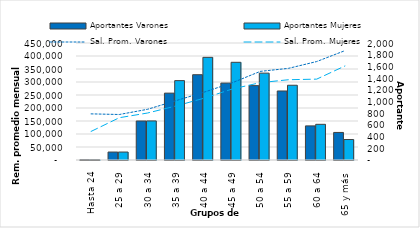
| Category | Aportantes Varones | Aportantes Mujeres |
|---|---|---|
| Hasta 24 | 5 | 4 |
| 25 a 29 | 136 | 136 |
| 30 a 34 | 667 | 668 |
| 35 a 39 | 1143 | 1357 |
| 40 a 44 | 1458 | 1755 |
| 45 a 49 | 1315 | 1670 |
| 50 a 54 | 1271 | 1485 |
| 55 a 59 | 1180 | 1278 |
| 60 a 64 | 583 | 610 |
| 65 y más | 471 | 350 |